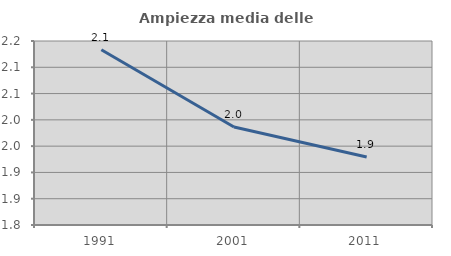
| Category | Ampiezza media delle famiglie |
|---|---|
| 1991.0 | 2.133 |
| 2001.0 | 1.986 |
| 2011.0 | 1.929 |